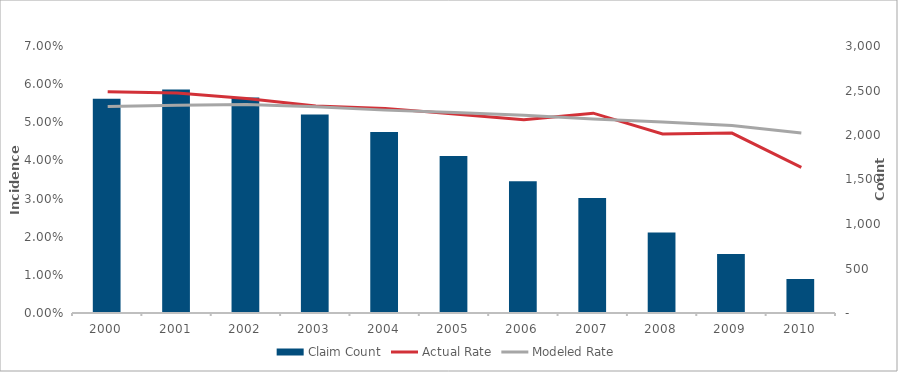
| Category | Claim Count |
|---|---|
| 2000.0 | 2408 |
| 2001.0 | 2510 |
| 2002.0 | 2422 |
| 2003.0 | 2229 |
| 2004.0 | 2035 |
| 2005.0 | 1765 |
| 2006.0 | 1481 |
| 2007.0 | 1292 |
| 2008.0 | 905 |
| 2009.0 | 663 |
| 2010.0 | 381 |